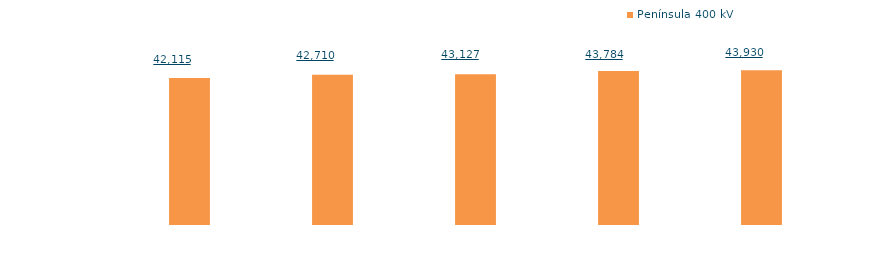
| Category | Península 400 kV |
|---|---|
| 2013 | 20639.478 |
| 2014 | 21093.512 |
| 2015 | 21183.826 |
| 2016 | 21618.968 |
| 2017 (1) | 21728.155 |